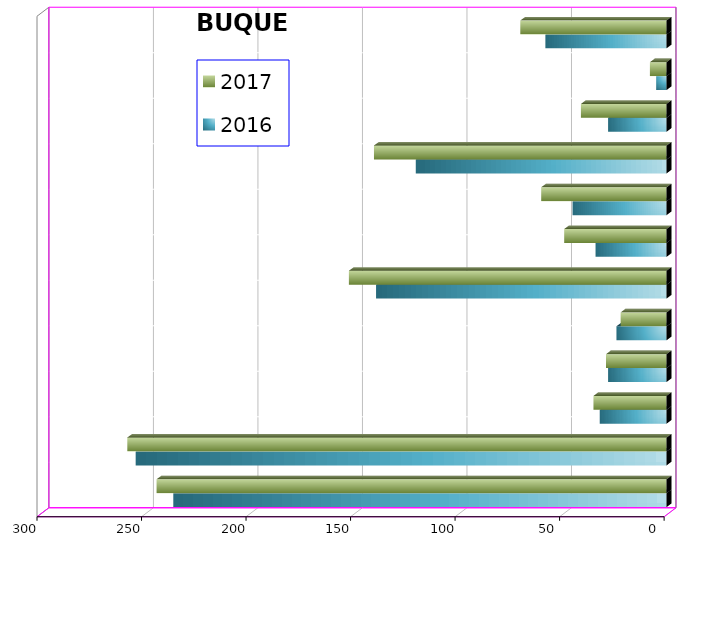
| Category | 2016 | 2017 |
|---|---|---|
| ICAVE | 236 | 244 |
| CICE | 254 | 258 |
| T. C. E. | 32 | 35 |
| CARGILL | 28 | 29 |
| TMV | 24 | 22 |
| SSA | 139 | 152 |
| SEPSA | 34 | 49 |
| VOPAK | 45 | 60 |
| CPV | 120 | 140 |
| EXCELLENCE | 28 | 41 |
| SIP | 5 | 8 |
| PEMEX | 58 | 70 |